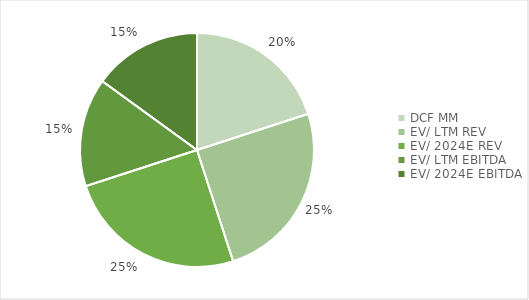
| Category | Series 0 |
|---|---|
| DCF MM | 0.2 |
| EV/ LTM REV | 0.25 |
| EV/ 2024E REV | 0.25 |
| EV/ LTM EBITDA | 0.15 |
| EV/ 2024E EBITDA | 0.15 |